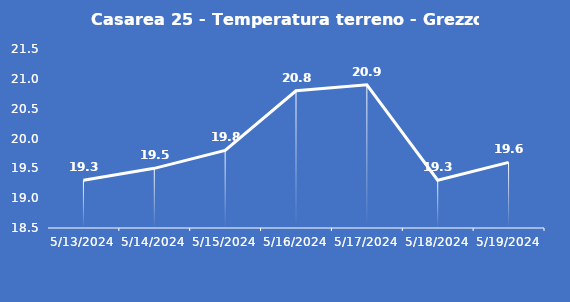
| Category | Casarea 25 - Temperatura terreno - Grezzo (°C) |
|---|---|
| 5/13/24 | 19.3 |
| 5/14/24 | 19.5 |
| 5/15/24 | 19.8 |
| 5/16/24 | 20.8 |
| 5/17/24 | 20.9 |
| 5/18/24 | 19.3 |
| 5/19/24 | 19.6 |